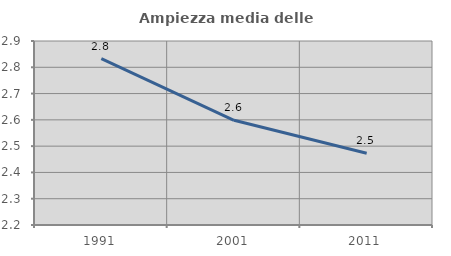
| Category | Ampiezza media delle famiglie |
|---|---|
| 1991.0 | 2.833 |
| 2001.0 | 2.598 |
| 2011.0 | 2.473 |